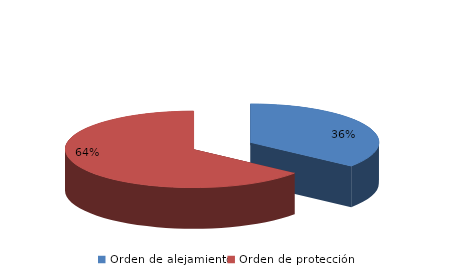
| Category | Series 0 |
|---|---|
| Orden de alejamiento | 134 |
| Orden de protección | 242 |